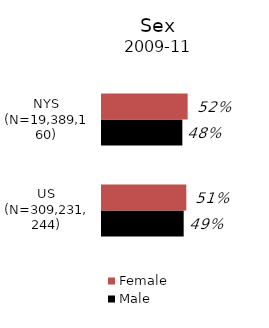
| Category | Male | Female |
|---|---|---|
| US (N=309,231,244) | 0.492 | 0.508 |
| NYS (N=19,389,160) | 0.484 | 0.516 |